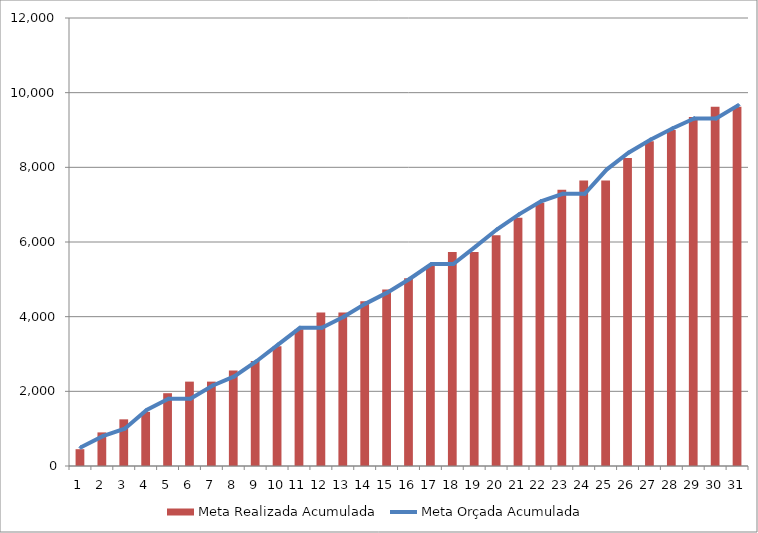
| Category | Meta Realizada Acumulada |
|---|---|
| 0 | 450 |
| 1 | 900 |
| 2 | 1250 |
| 3 | 1450 |
| 4 | 1950 |
| 5 | 2260 |
| 6 | 2260 |
| 7 | 2560 |
| 8 | 2810 |
| 9 | 3210 |
| 10 | 3660 |
| 11 | 4110 |
| 12 | 4110 |
| 13 | 4410 |
| 14 | 4730 |
| 15 | 5030 |
| 16 | 5380 |
| 17 | 5730 |
| 18 | 5730 |
| 19 | 6180 |
| 20 | 6650 |
| 21 | 7050 |
| 22 | 7400 |
| 23 | 7650 |
| 24 | 7650 |
| 25 | 8250 |
| 26 | 8700 |
| 27 | 9000 |
| 28 | 9350 |
| 29 | 9620 |
| 30 | 9620 |